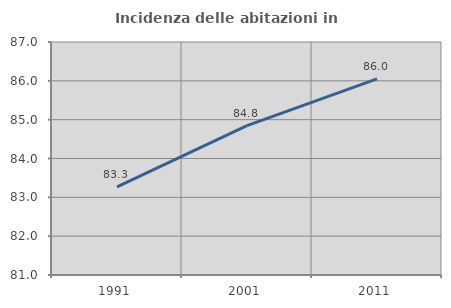
| Category | Incidenza delle abitazioni in proprietà  |
|---|---|
| 1991.0 | 83.272 |
| 2001.0 | 84.848 |
| 2011.0 | 86.049 |